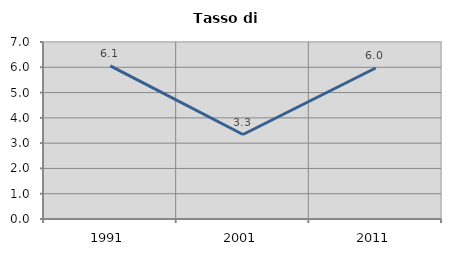
| Category | Tasso di disoccupazione   |
|---|---|
| 1991.0 | 6.053 |
| 2001.0 | 3.341 |
| 2011.0 | 5.973 |